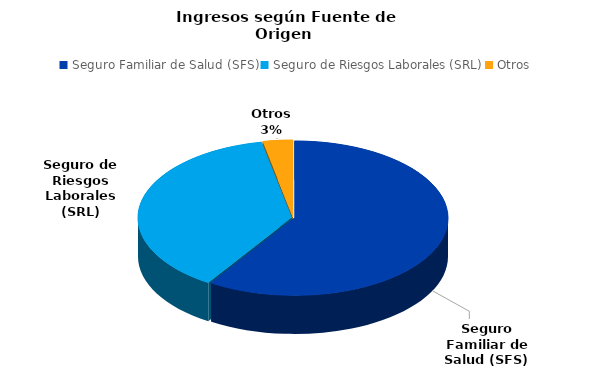
| Category | Series 0 |
|---|---|
| Seguro Familiar de Salud (SFS) | 104990264.32 |
| Seguro de Riesgos Laborales (SRL) | 67002887.99 |
| Otros | 5602112.74 |